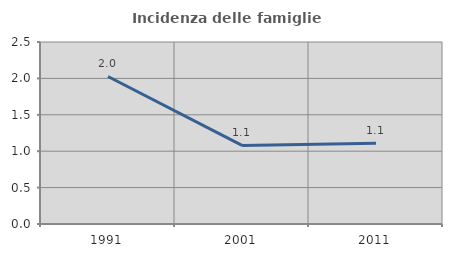
| Category | Incidenza delle famiglie numerose |
|---|---|
| 1991.0 | 2.026 |
| 2001.0 | 1.079 |
| 2011.0 | 1.11 |